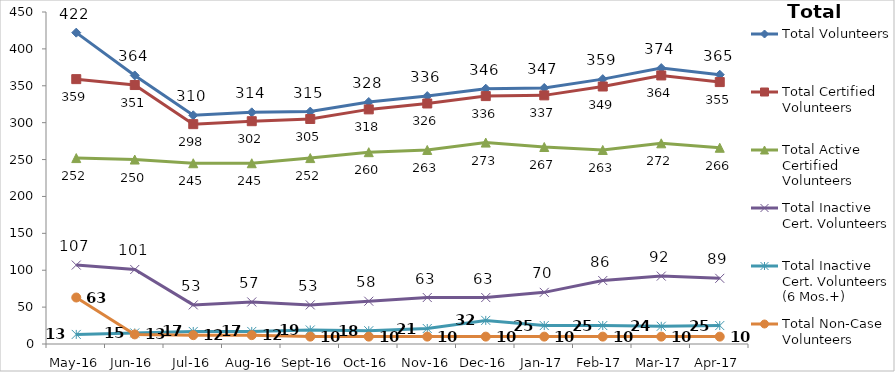
| Category | Total Volunteers | Total Certified Volunteers | Total Active Certified Volunteers | Total Inactive Cert. Volunteers | Total Inactive Cert. Volunteers (6 Mos.+) | Total Non-Case Volunteers |
|---|---|---|---|---|---|---|
| May-16 | 422 | 359 | 252 | 107 | 13 | 63 |
| Jun-16 | 364 | 351 | 250 | 101 | 15 | 13 |
| Jul-16 | 310 | 298 | 245 | 53 | 17 | 12 |
| Aug-16 | 314 | 302 | 245 | 57 | 17 | 12 |
| Sep-16 | 315 | 305 | 252 | 53 | 19 | 10 |
| Oct-16 | 328 | 318 | 260 | 58 | 18 | 10 |
| Nov-16 | 336 | 326 | 263 | 63 | 21 | 10 |
| Dec-16 | 346 | 336 | 273 | 63 | 32 | 10 |
| Jan-17 | 347 | 337 | 267 | 70 | 25 | 10 |
| Feb-17 | 359 | 349 | 263 | 86 | 25 | 10 |
| Mar-17 | 374 | 364 | 272 | 92 | 24 | 10 |
| Apr-17 | 365 | 355 | 266 | 89 | 25 | 10 |